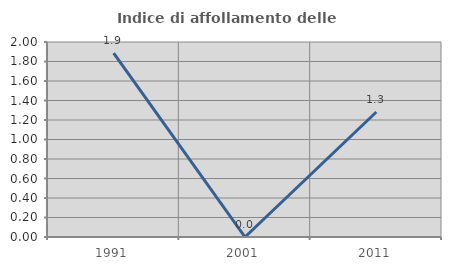
| Category | Indice di affollamento delle abitazioni  |
|---|---|
| 1991.0 | 1.887 |
| 2001.0 | 0 |
| 2011.0 | 1.282 |